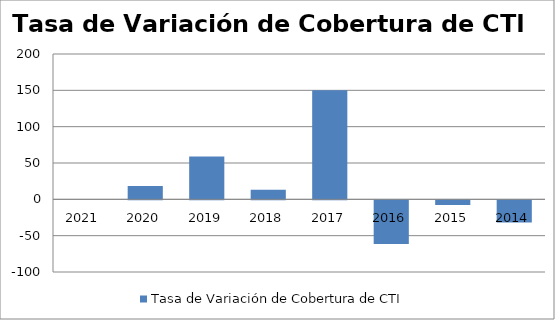
| Category | Tasa de Variación de Cobertura de CTI |
|---|---|
| 2021.0 | 0 |
| 2020.0 | 18.519 |
| 2019.0 | 58.824 |
| 2018.0 | 13.333 |
| 2017.0 | 150 |
| 2016.0 | -60 |
| 2015.0 | -6.25 |
| 2014.0 | -30.435 |